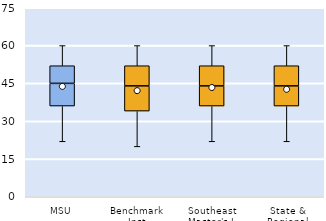
| Category | 25th | 50th | 75th |
|---|---|---|---|
| MSU | 36 | 9 | 7 |
| Benchmark Inst | 34 | 10 | 8 |
| Southeast Master's-L | 36 | 8 | 8 |
| State & Regional | 36 | 8 | 8 |